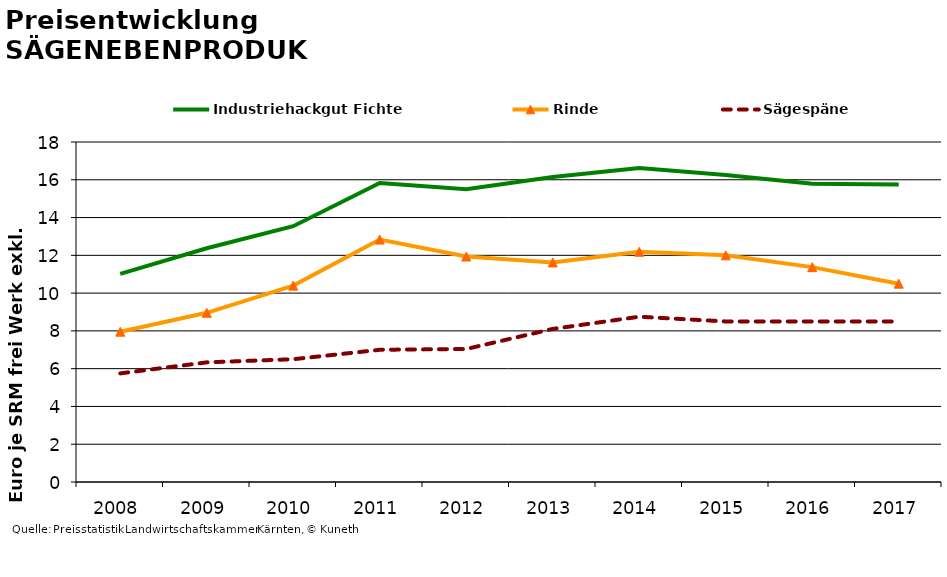
| Category | Industriehackgut Fichte | Rinde | Sägespäne |
|---|---|---|---|
| 2008.0 | 11.021 | 7.958 | 5.75 |
| 2009.0 | 12.375 | 8.958 | 6.333 |
| 2010.0 | 13.542 | 10.396 | 6.5 |
| 2011.0 | 15.833 | 12.833 | 7 |
| 2012.0 | 15.5 | 11.938 | 7.042 |
| 2013.0 | 16.146 | 11.625 | 8.104 |
| 2014.0 | 16.625 | 12.188 | 8.75 |
| 2015.0 | 16.25 | 12 | 8.5 |
| 2016.0 | 15.792 | 11.375 | 8.5 |
| 2017.0 | 15.75 | 10.5 | 8.5 |